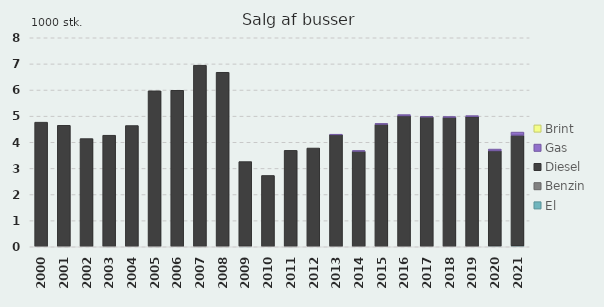
| Category | El | Benzin | Diesel | Gas | Brint |
|---|---|---|---|---|---|
| 2000 | 0 | 0 | 4.77 | 0 | 0 |
| 2001 | 0 | 0.01 | 4.64 | 0 | 0 |
| 2002 | 0 | 0 | 4.14 | 0 | 0 |
| 2003 | 0 | 0.01 | 4.26 | 0 | 0 |
| 2004 | 0 | 0 | 4.64 | 0 | 0 |
| 2005 | 0 | 0.01 | 5.96 | 0 | 0 |
| 2006 | 0 | 0 | 5.99 | 0 | 0 |
| 2007 | 0 | 0.01 | 6.94 | 0 | 0 |
| 2008 | 0 | 0.01 | 6.67 | 0 | 0 |
| 2009 | 0.01 | 0.01 | 3.24 | 0 | 0 |
| 2010 | 0 | 0 | 2.73 | 0 | 0 |
| 2011 | 0 | 0.01 | 3.68 | 0 | 0 |
| 2012 | 0 | 0 | 3.78 | 0 | 0 |
| 2013 | 0 | 0 | 4.29 | 0.01 | 0 |
| 2014 | 0 | 0 | 3.66 | 0.02 | 0 |
| 2015 | 0 | 0 | 4.69 | 0.03 | 0 |
| 2016 | 0 | 0 | 5.01 | 0.05 | 0 |
| 2017 | 0 | 0 | 4.97 | 0.02 | 0 |
| 2018 | 0 | 0 | 4.96 | 0.02 | 0 |
| 2019 | 0 | 0 | 4.98 | 0.04 | 0 |
| 2020 | 0.02 | 0 | 3.65 | 0.07 | 0 |
| 2021 | 0.03 | 0 | 4.24 | 0.12 | 0 |